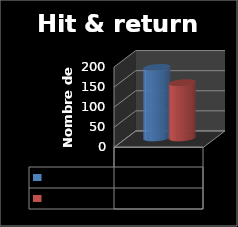
| Category | Contrats | Return OK |
|---|---|---|
| 0 | 176 | 138 |